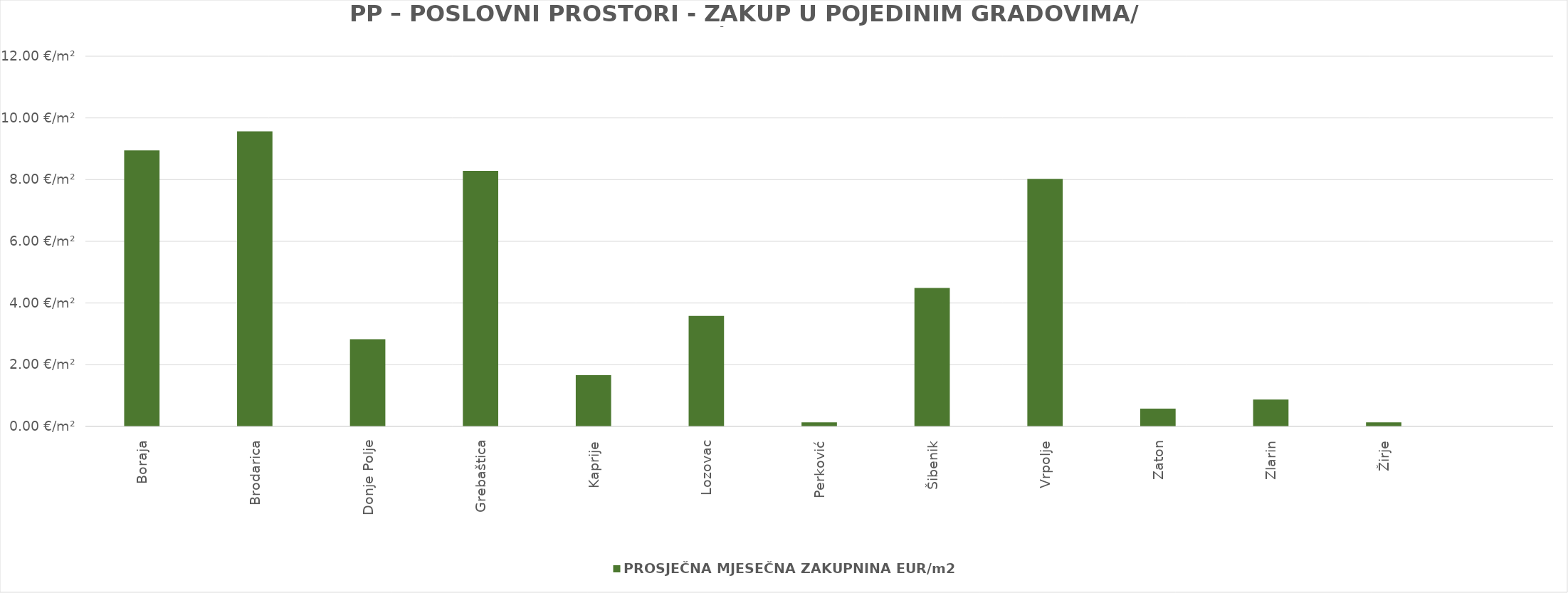
| Category | PROSJEČNA MJESEČNA ZAKUPNINA EUR/m2 |
|---|---|
| Boraja | 1900-01-08 22:43:42 |
| Brodarica | 1900-01-09 13:30:27 |
| Donje Polje | 1900-01-02 19:52:45 |
| Grebaštica | 1900-01-08 06:47:20 |
| Kaprije | 1900-01-01 15:51:26 |
| Lozovac | 1900-01-03 13:58:06 |
| Perković | 0.133 |
| Šibenik | 1900-01-04 11:46:02 |
| Vrpolje | 1900-01-08 00:35:18 |
| Zaton | 0.575 |
| Zlarin | 0.872 |
| Žirje | 0.133 |